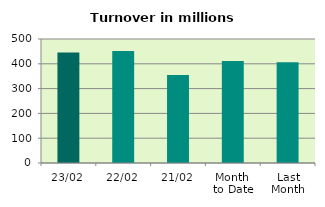
| Category | Series 0 |
|---|---|
| 23/02 | 445.445 |
| 22/02 | 451.273 |
| 21/02 | 354.555 |
| Month 
to Date | 410.87 |
| Last
Month | 406.741 |